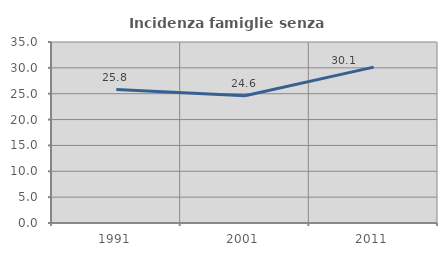
| Category | Incidenza famiglie senza nuclei |
|---|---|
| 1991.0 | 25.806 |
| 2001.0 | 24.615 |
| 2011.0 | 30.144 |